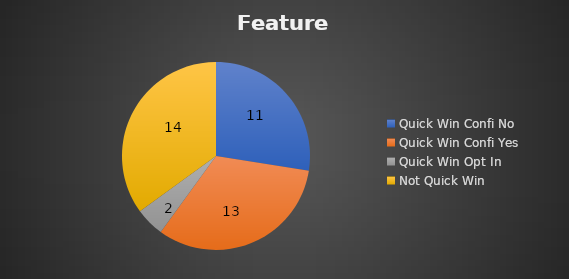
| Category | Series 0 |
|---|---|
| Quick Win Confi No | 11 |
| Quick Win Confi Yes | 13 |
| Quick Win Opt In | 2 |
| Not Quick Win | 14 |